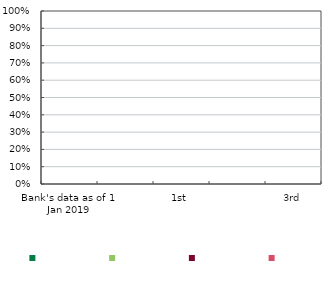
| Category | Series 0 | Series 1 | Series 2 | Series 3 |
|---|---|---|---|---|
| Bank's data as of 1 Jan 2019 | 0 | 0 | 0 | 0 |
| AQR as of 1 Jan 2019 | 0 | 0 | 0 | 0 |
| 1st | 0 | 0 | 0 | 0 |
| 2nd | 0 | 0 | 0 | 0 |
| 3rd | 0 | 0 | 0 | 0 |